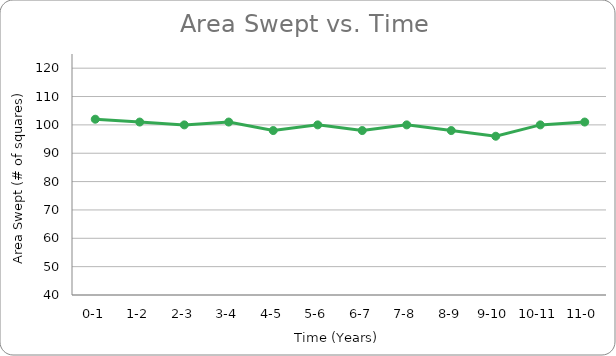
| Category | Series 0 |
|---|---|
| 0-1 | 102 |
| 1-2 | 101 |
| 2-3 | 100 |
| 3-4 | 101 |
| 4-5 | 98 |
| 5-6 | 100 |
| 6-7 | 98 |
| 7-8 | 100 |
| 8-9 | 98 |
| 9-10 | 96 |
| 10-11 | 100 |
| 11-0 | 101 |